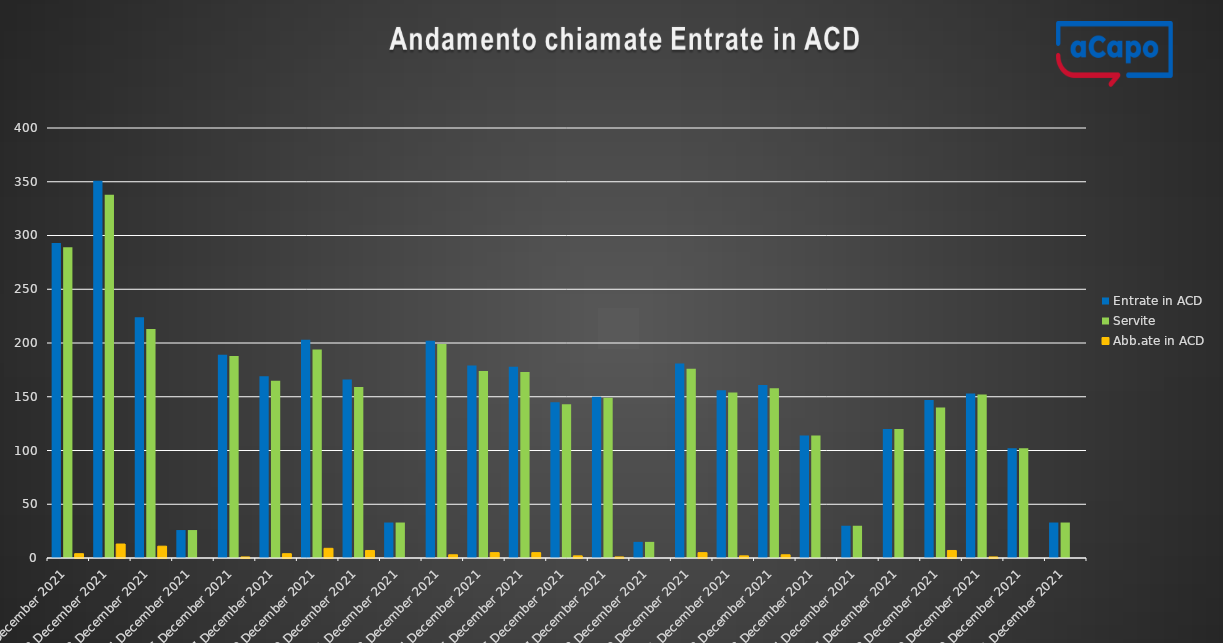
| Category | Entrate in ACD | Servite | Abb.ate in ACD |
|---|---|---|---|
| 2021-12-01 | 293 | 289 | 4 |
| 2021-12-02 | 351 | 338 | 13 |
| 2021-12-03 | 224 | 213 | 11 |
| 2021-12-04 | 26 | 26 | 0 |
| 2021-12-06 | 189 | 188 | 1 |
| 2021-12-07 | 169 | 165 | 4 |
| 2021-12-09 | 203 | 194 | 9 |
| 2021-12-10 | 166 | 159 | 7 |
| 2021-12-11 | 33 | 33 | 0 |
| 2021-12-13 | 202 | 199 | 3 |
| 2021-12-14 | 179 | 174 | 5 |
| 2021-12-15 | 178 | 173 | 5 |
| 2021-12-16 | 145 | 143 | 2 |
| 2021-12-17 | 150 | 149 | 1 |
| 2021-12-18 | 15 | 15 | 0 |
| 2021-12-20 | 181 | 176 | 5 |
| 2021-12-21 | 156 | 154 | 2 |
| 2021-12-22 | 161 | 158 | 3 |
| 2021-12-23 | 114 | 114 | 0 |
| 2021-12-24 | 30 | 30 | 0 |
| 2021-12-27 | 120 | 120 | 0 |
| 2021-12-28 | 147 | 140 | 7 |
| 2021-12-29 | 153 | 152 | 1 |
| 2021-12-30 | 102 | 102 | 0 |
| 2021-12-31 | 33 | 33 | 0 |